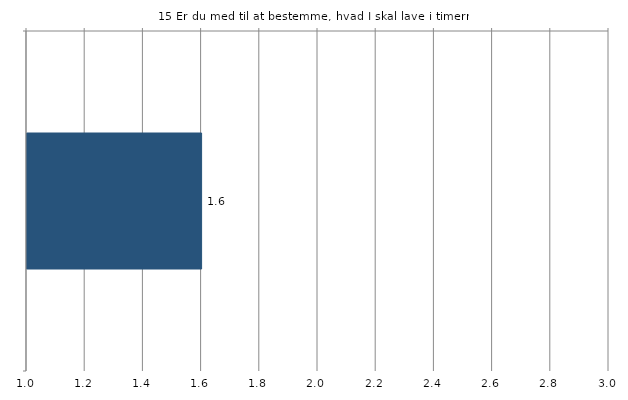
| Category | Gns. |
|---|---|
|   | 1.6 |